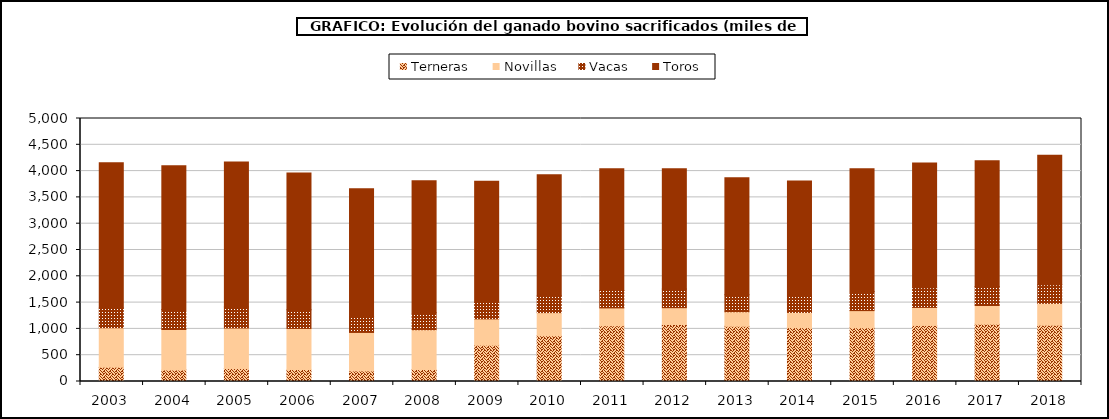
| Category | Terneras | Novillas | Vacas | Toros |
|---|---|---|---|---|
| 2003.0 | 269.48 | 751.965 | 374.846 | 2763.095 |
| 2004.0 | 220.638 | 767.767 | 380.128 | 2732.046 |
| 2005.0 | 246.944 | 769.645 | 400.576 | 2757.558 |
| 2006.0 | 227.871 | 780.95 | 355.484 | 2599.095 |
| 2007.0 | 197.822 | 735.107 | 301.795 | 2427.983 |
| 2008.0 | 225.783 | 758.655 | 323.877 | 2506.734 |
| 2009.0 | 690.106 | 500.364 | 312.199 | 2306.595 |
| 2010.0 | 869.716 | 439.941 | 318.432 | 2302.089 |
| 2011.0 | 1059.2 | 339.951 | 331.79 | 2314.752 |
| 2012.0 | 1083.19 | 319.983 | 353.838 | 2285.924 |
| 2013.0 | 1050.071 | 276.098 | 323.4 | 2222.003 |
| 2014.0 | 1023.638 | 289.637 | 314.523 | 2182.59 |
| 2015.0 | 1021.185 | 326.435 | 364.083 | 2333.895 |
| 2016.0 | 1065.529 | 342.877 | 373.921 | 2373.85 |
| 2017.0 | 1089.661 | 355.447 | 361.984 | 2391.003 |
| 2018.0 | 1069.502 | 416.616 | 352.939 | 2462.557 |